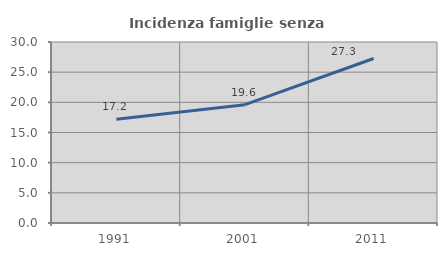
| Category | Incidenza famiglie senza nuclei |
|---|---|
| 1991.0 | 17.212 |
| 2001.0 | 19.608 |
| 2011.0 | 27.268 |